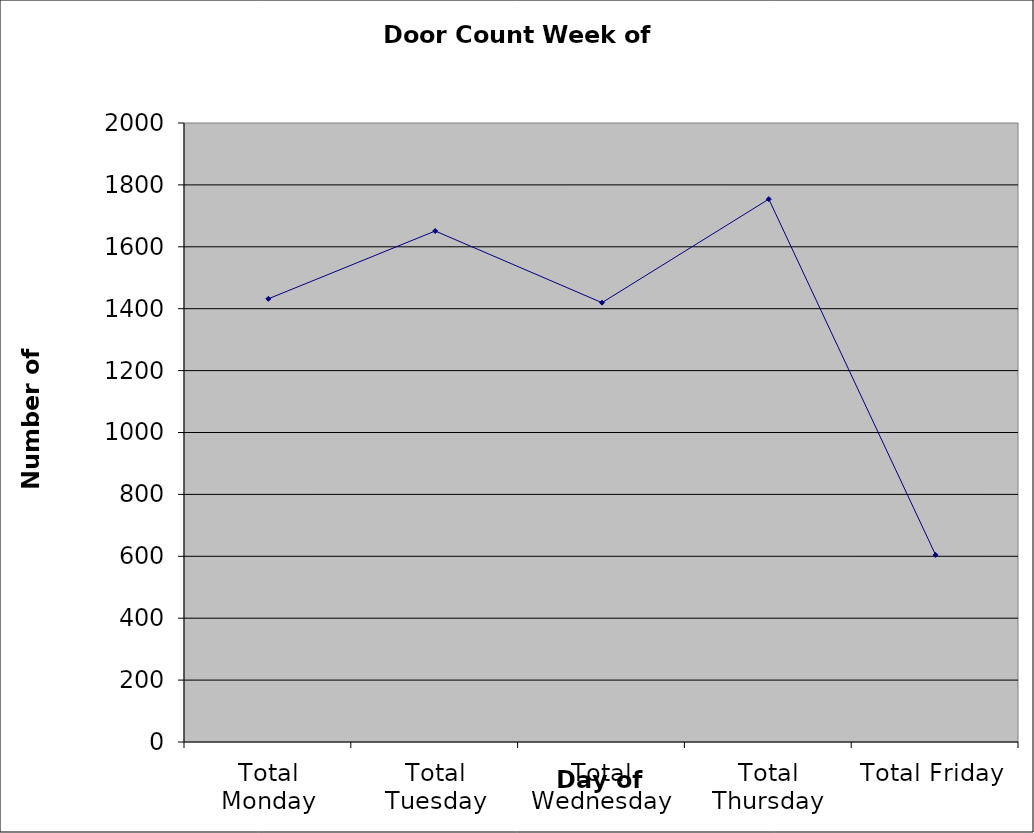
| Category | Series 0 |
|---|---|
| Total Monday | 1432 |
| Total Tuesday | 1651 |
| Total Wednesday | 1419.5 |
| Total Thursday | 1754 |
| Total Friday | 604.5 |